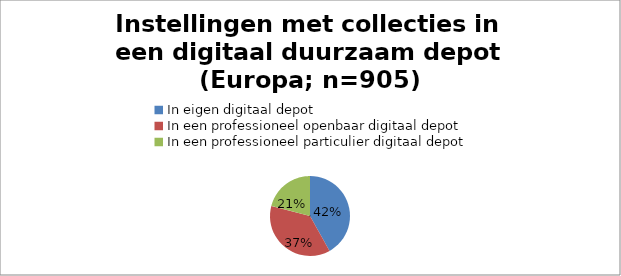
| Category | Series 0 |
|---|---|
| In eigen digitaal depot | 18 |
| In een professioneel openbaar digitaal depot | 16 |
| In een professioneel particulier digitaal depot | 9 |